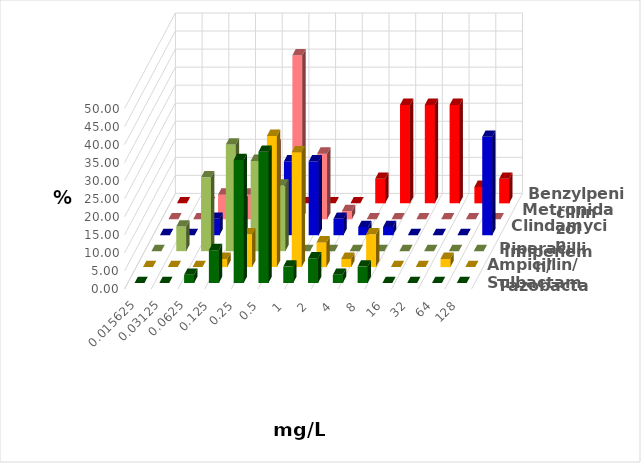
| Category | Ampicillin/ Sulbactam | Piperacillin/ Tazobactam | Imipenem | Clindamycin | Metronidazol | Benzylpenicillin |
|---|---|---|---|---|---|---|
| 0.015625 | 0 | 0 | 0 | 0 | 0 | 0 |
| 0.03125 | 0 | 0 | 6.818 | 0 | 0 | 0 |
| 0.0625 | 2.273 | 0 | 20.455 | 4.545 | 6.818 | 0 |
| 0.125 | 9.091 | 2.273 | 29.545 | 9.091 | 6.818 | 0 |
| 0.25 | 34.091 | 9.091 | 25 | 9.091 | 20.455 | 0 |
| 0.5 | 36.364 | 36.364 | 18.182 | 20.455 | 45.455 | 0 |
| 1.0 | 4.545 | 31.818 | 0 | 20.455 | 18.182 | 0 |
| 2.0 | 6.818 | 6.818 | 0 | 4.545 | 2.273 | 0 |
| 4.0 | 2.273 | 2.273 | 0 | 2.273 | 0 | 6.818 |
| 8.0 | 4.545 | 9.091 | 0 | 2.273 | 0 | 27.273 |
| 16.0 | 0 | 0 | 0 | 0 | 0 | 27.273 |
| 32.0 | 0 | 0 | 0 | 0 | 0 | 27.273 |
| 64.0 | 0 | 2.273 | 0 | 0 | 0 | 4.545 |
| 128.0 | 0 | 0 | 0 | 27.273 | 0 | 6.818 |